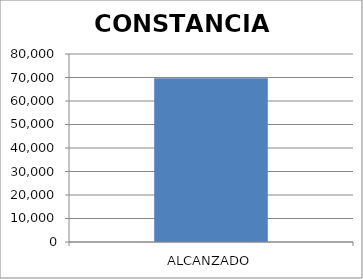
| Category | CONSTANCIAS  |
|---|---|
| ALCANZADO | 69630 |